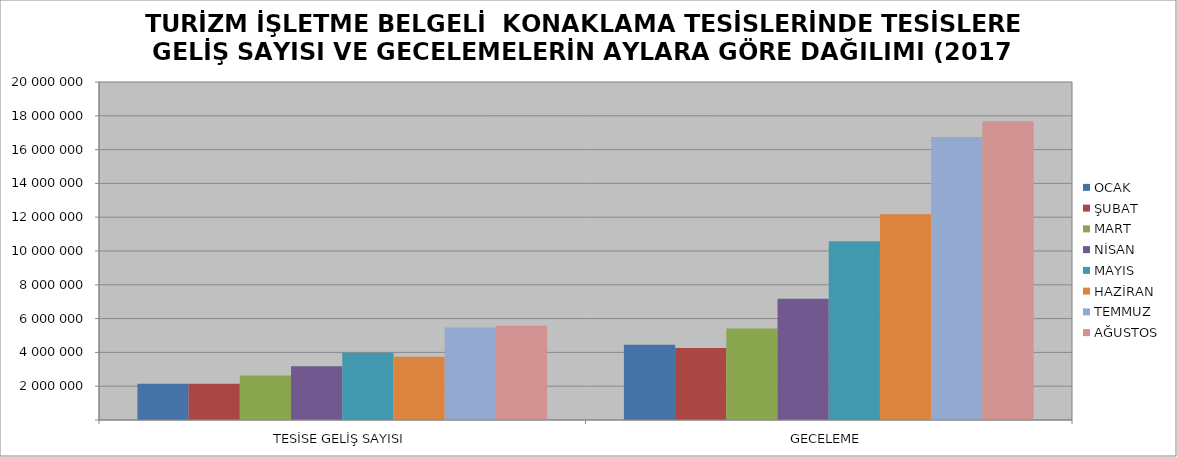
| Category | OCAK | ŞUBAT | MART | NİSAN | MAYIS | HAZİRAN | TEMMUZ | AĞUSTOS |
|---|---|---|---|---|---|---|---|---|
| TESİSE GELİŞ SAYISI | 2146994 | 2141043 | 2629734 | 3173381 | 3978651 | 3742131 | 5470767 | 5580002 |
| GECELEME | 4457352 | 4260377 | 5413903 | 7176325 | 10579158 | 12172370 | 16748728 | 17679357 |